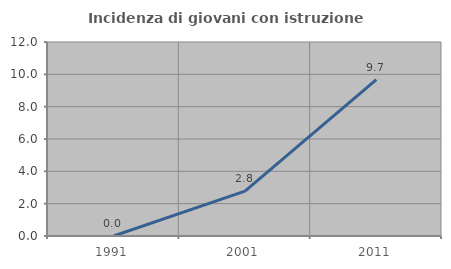
| Category | Incidenza di giovani con istruzione universitaria |
|---|---|
| 1991.0 | 0 |
| 2001.0 | 2.778 |
| 2011.0 | 9.677 |